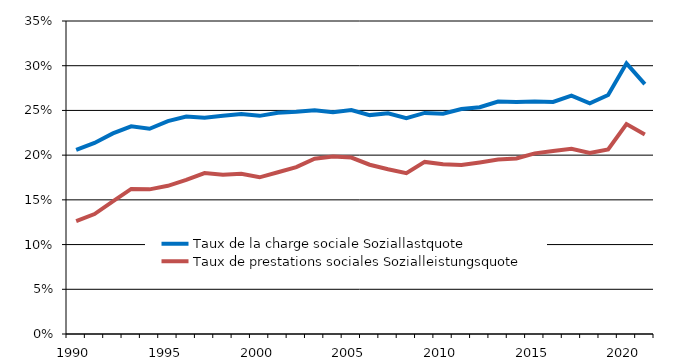
| Category | Taux de la charge sociale | Taux de prestations sociales |
|---|---|---|
| 1990.0 | 0.206 | 0.126 |
| 1991.0 | 0.214 | 0.134 |
| 1992.0 | 0.224 | 0.148 |
| 1993.0 | 0.232 | 0.162 |
| 1994.0 | 0.229 | 0.162 |
| 1995.0 | 0.238 | 0.166 |
| 1996.0 | 0.243 | 0.172 |
| 1997.0 | 0.242 | 0.18 |
| 1998.0 | 0.244 | 0.178 |
| 1999.0 | 0.246 | 0.179 |
| 2000.0 | 0.244 | 0.175 |
| 2001.0 | 0.247 | 0.181 |
| 2002.0 | 0.249 | 0.187 |
| 2003.0 | 0.25 | 0.196 |
| 2004.0 | 0.248 | 0.198 |
| 2005.0 | 0.25 | 0.197 |
| 2006.0 | 0.245 | 0.189 |
| 2007.0 | 0.247 | 0.184 |
| 2008.0 | 0.241 | 0.18 |
| 2009.0 | 0.247 | 0.192 |
| 2010.0 | 0.246 | 0.19 |
| 2011.0 | 0.252 | 0.189 |
| 2012.0 | 0.254 | 0.192 |
| 2013.0 | 0.26 | 0.195 |
| 2014.0 | 0.259 | 0.196 |
| 2015.0 | 0.26 | 0.202 |
| 2016.0 | 0.26 | 0.205 |
| 2017.0 | 0.267 | 0.207 |
| 2018.0 | 0.258 | 0.202 |
| 2019.0 | 0.267 | 0.206 |
| 2020.0 | 0.303 | 0.235 |
| 2021.0 | 0.279 | 0.223 |